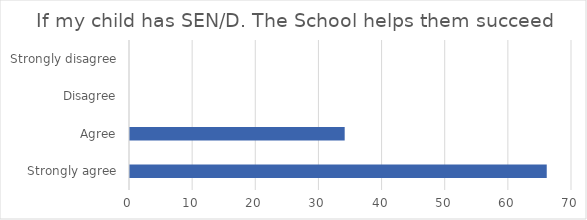
| Category | Series 1 |
|---|---|
| Strongly agree | 66 |
| Agree | 34 |
| Disagree | 0 |
| Strongly disagree | 0 |